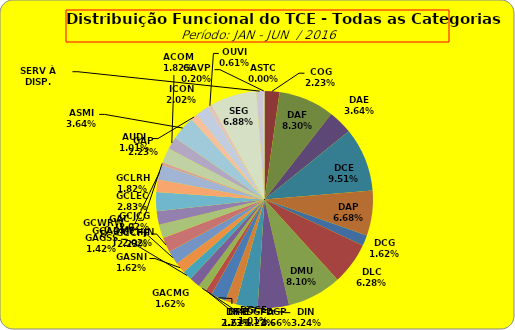
| Category | ASTC |
|---|---|
| ASTC | 0 |
| COG | 11 |
| DAF | 41 |
| DAE | 18 |
| DCE | 47 |
| DAP | 33 |
| DCG | 8 |
| DLC | 31 |
| DMU | 40 |
| DGP | 23 |
| DIN | 16 |
| DPE | 8 |
| DRR | 11 |
| DGCE | 5 |
| DGPA | 6 |
| GACMG | 8 |
| GAGSS | 7 |
| GASNI | 8 |
| GCADMFJ | 10 |
| GCCFF | 11 |
| GCHJN | 10 |
| GCJCG | 10 |
| GCLEC | 14 |
| GCLRH | 9 |
| GCWRWD | 11 |
| GAC | 2 |
| GAP | 11 |
| ACOM | 9 |
| ASMI | 18 |
| AUDI | 5 |
| ICON | 10 |
| OUVI | 3 |
| SEG | 34 |
| SERV À DISP. | 5 |
| GAVP | 1 |